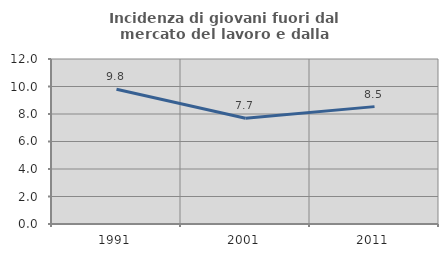
| Category | Incidenza di giovani fuori dal mercato del lavoro e dalla formazione  |
|---|---|
| 1991.0 | 9.804 |
| 2001.0 | 7.692 |
| 2011.0 | 8.537 |